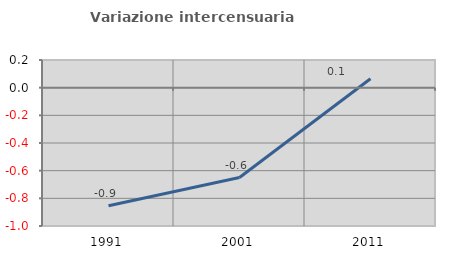
| Category | Variazione intercensuaria annua |
|---|---|
| 1991.0 | -0.853 |
| 2001.0 | -0.65 |
| 2011.0 | 0.064 |